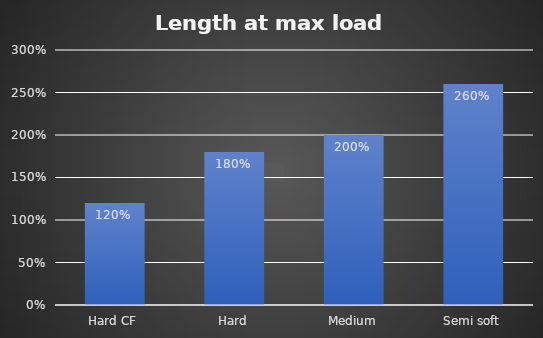
| Category | Average |
|---|---|
| Hard CF | 1.2 |
| Hard | 1.8 |
| Medium | 2 |
| Semi soft | 2.6 |